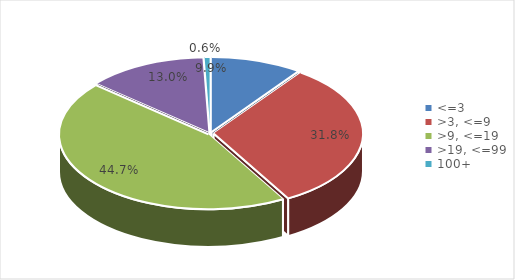
| Category | Enterprises  |
|---|---|
| <=3 | 0.099 |
| >3, <=9 | 0.318 |
| >9, <=19 | 0.447 |
| >19, <=99 | 0.13 |
| 100+ | 0.006 |